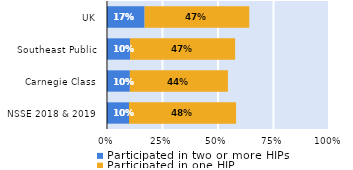
| Category | Participated in two or more HIPs | Participated in one HIP |
|---|---|---|
| NSSE 2018 & 2019 | 0.099 | 0.482 |
| Carnegie Class | 0.103 | 0.442 |
| Southeast Public | 0.104 | 0.473 |
| UK | 0.169 | 0.471 |